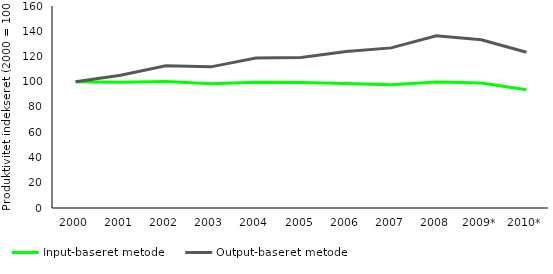
| Category | Input-baseret metode | Output-baseret metode |
|---|---|---|
| 2000 | 100 | 100 |
| 2001 | 99.634 | 105.184 |
| 2002 | 100.265 | 112.65 |
| 2003 | 98.415 | 111.786 |
| 2004 | 99.648 | 118.802 |
| 2005 | 99.362 | 119.249 |
| 2006 | 98.573 | 123.872 |
| 2007 | 97.675 | 126.824 |
| 2008 | 99.824 | 136.439 |
| 2009* | 98.98 | 133.303 |
| 2010* | 93.582 | 123.327 |